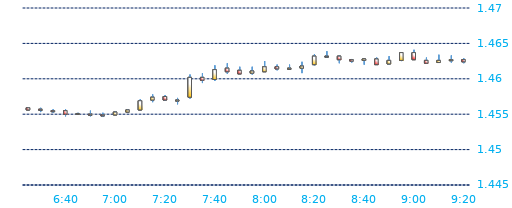
| Category | Series 0 | Series 1 | Series 2 | Series 3 |
|---|---|---|---|---|
| 2016-04-26 09:20:00 | 1.463 | 1.463 | 1.462 | 1.462 |
| 2016-04-26 09:15:00 | 1.463 | 1.463 | 1.462 | 1.463 |
| 2016-04-26 09:10:00 | 1.462 | 1.463 | 1.462 | 1.463 |
| 2016-04-26 09:05:00 | 1.463 | 1.463 | 1.462 | 1.462 |
| 2016-04-26 09:00:00 | 1.464 | 1.464 | 1.463 | 1.463 |
| 2016-04-26 08:55:00 | 1.463 | 1.464 | 1.462 | 1.464 |
| 2016-04-26 08:50:00 | 1.462 | 1.463 | 1.462 | 1.463 |
| 2016-04-26 08:45:00 | 1.463 | 1.463 | 1.462 | 1.462 |
| 2016-04-26 08:40:00 | 1.463 | 1.463 | 1.462 | 1.463 |
| 2016-04-26 08:35:00 | 1.463 | 1.463 | 1.462 | 1.462 |
| 2016-04-26 08:30:00 | 1.463 | 1.463 | 1.462 | 1.463 |
| 2016-04-26 08:25:00 | 1.463 | 1.464 | 1.463 | 1.463 |
| 2016-04-26 08:20:00 | 1.462 | 1.464 | 1.462 | 1.463 |
| 2016-04-26 08:15:00 | 1.462 | 1.462 | 1.461 | 1.462 |
| 2016-04-26 08:10:00 | 1.461 | 1.462 | 1.461 | 1.462 |
| 2016-04-26 08:05:00 | 1.462 | 1.462 | 1.461 | 1.461 |
| 2016-04-26 08:00:00 | 1.461 | 1.462 | 1.461 | 1.462 |
| 2016-04-26 07:55:00 | 1.461 | 1.462 | 1.461 | 1.461 |
| 2016-04-26 07:50:00 | 1.461 | 1.462 | 1.461 | 1.461 |
| 2016-04-26 07:45:00 | 1.462 | 1.462 | 1.461 | 1.461 |
| 2016-04-26 07:40:00 | 1.46 | 1.462 | 1.46 | 1.461 |
| 2016-04-26 07:35:00 | 1.46 | 1.461 | 1.459 | 1.46 |
| 2016-04-26 07:30:00 | 1.457 | 1.461 | 1.457 | 1.46 |
| 2016-04-26 07:25:00 | 1.457 | 1.457 | 1.456 | 1.457 |
| 2016-04-26 07:20:00 | 1.458 | 1.458 | 1.457 | 1.457 |
| 2016-04-26 07:15:00 | 1.457 | 1.458 | 1.457 | 1.457 |
| 2016-04-26 07:10:00 | 1.456 | 1.457 | 1.456 | 1.457 |
| 2016-04-26 07:05:00 | 1.455 | 1.456 | 1.455 | 1.456 |
| 2016-04-26 07:00:00 | 1.455 | 1.455 | 1.455 | 1.455 |
| 2016-04-26 06:55:00 | 1.455 | 1.455 | 1.455 | 1.455 |
| 2016-04-26 06:50:00 | 1.455 | 1.456 | 1.455 | 1.455 |
| 2016-04-26 06:45:00 | 1.455 | 1.455 | 1.455 | 1.455 |
| 2016-04-26 06:40:00 | 1.456 | 1.456 | 1.455 | 1.455 |
| 2016-04-26 06:35:00 | 1.456 | 1.456 | 1.455 | 1.455 |
| 2016-04-26 06:30:00 | 1.456 | 1.456 | 1.455 | 1.456 |
| 2016-04-26 06:25:00 | 1.456 | 1.456 | 1.456 | 1.456 |